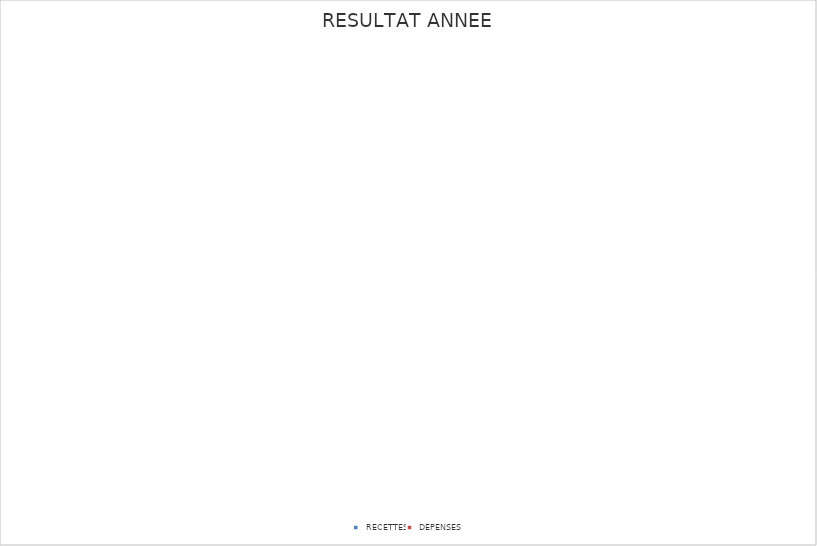
| Category | Series 0 |
|---|---|
|  RECETTES  | 0 |
|  DEPENSES  | 0 |